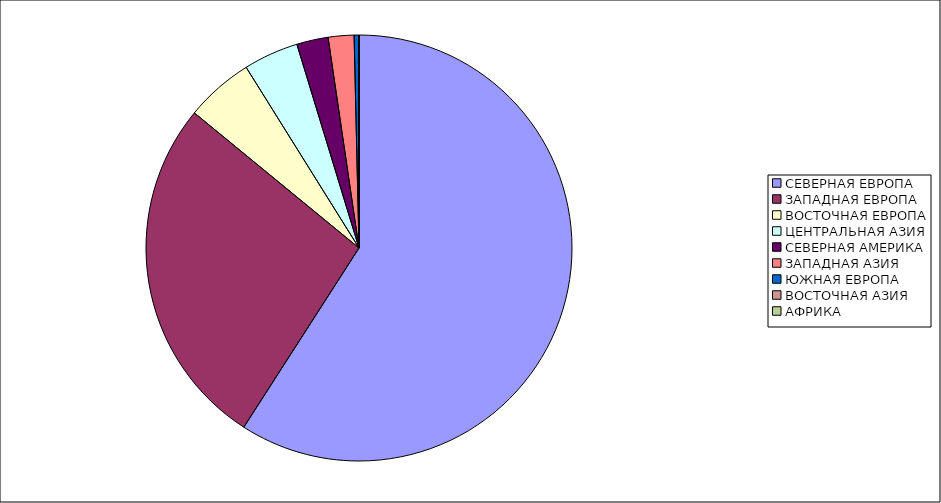
| Category | Оборот |
|---|---|
| СЕВЕРНАЯ ЕВРОПА | 59.093 |
| ЗАПАДНАЯ ЕВРОПА | 26.843 |
| ВОСТОЧНАЯ ЕВРОПА | 5.178 |
| ЦЕНТРАЛЬНАЯ АЗИЯ | 4.176 |
| СЕВЕРНАЯ АМЕРИКА | 2.389 |
| ЗАПАДНАЯ АЗИЯ | 1.955 |
| ЮЖНАЯ ЕВРОПА | 0.344 |
| ВОСТОЧНАЯ АЗИЯ | 0.023 |
| АФРИКА | 0 |